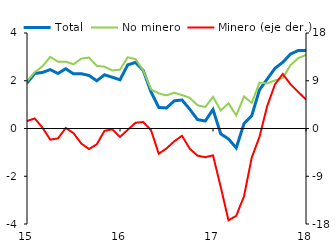
| Category | Total | No minero |
|---|---|---|
| 2015-01-01 | 1.906 | 1.98 |
| 2015-02-01 | 2.305 | 2.357 |
| 2015-03-01 | 2.348 | 2.606 |
| 2015-04-01 | 2.466 | 3 |
| 2015-05-01 | 2.304 | 2.799 |
| 2015-06-01 | 2.505 | 2.8 |
| 2015-07-01 | 2.289 | 2.688 |
| 2015-08-01 | 2.295 | 2.926 |
| 2015-09-01 | 2.221 | 2.974 |
| 2015-10-01 | 1.998 | 2.623 |
| 2015-11-01 | 2.249 | 2.589 |
| 2015-12-01 | 2.147 | 2.432 |
| 2016-01-01 | 2.039 | 2.463 |
| 2016-02-01 | 2.665 | 2.983 |
| 2016-03-01 | 2.768 | 2.907 |
| 2016-04-01 | 2.43 | 2.424 |
| 2016-05-01 | 1.532 | 1.637 |
| 2016-06-01 | 0.881 | 1.47 |
| 2016-07-01 | 0.86 | 1.385 |
| 2016-08-01 | 1.159 | 1.501 |
| 2016-09-01 | 1.196 | 1.401 |
| 2016-10-01 | 0.807 | 1.286 |
| 2016-11-01 | 0.374 | 0.975 |
| 2016-12-01 | 0.313 | 0.9 |
| 2017-01-01 | 0.795 | 1.323 |
| 2017-02-01 | -0.225 | 0.755 |
| 2017-03-01 | -0.437 | 1.055 |
| 2017-04-01 | -0.813 | 0.55 |
| 2017-05-01 | 0.204 | 1.342 |
| 2017-06-01 | 0.538 | 1.073 |
| 2017-07-01 | 1.622 | 1.923 |
| 2017-08-01 | 2.074 | 1.888 |
| 2017-09-01 | 2.523 | 2.016 |
| 2017-10-01 | 2.772 | 2.113 |
| 2017-11-02 | 3.118 | 2.657 |
| 2017-12-02 | 3.267 | 2.948 |
| 2018-01-02 | 3.273 | 3.084 |